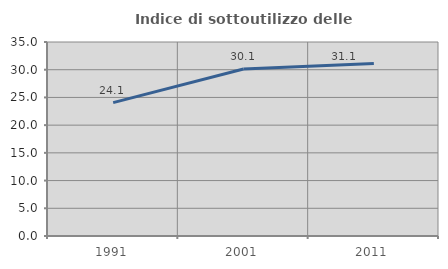
| Category | Indice di sottoutilizzo delle abitazioni  |
|---|---|
| 1991.0 | 24.062 |
| 2001.0 | 30.116 |
| 2011.0 | 31.1 |